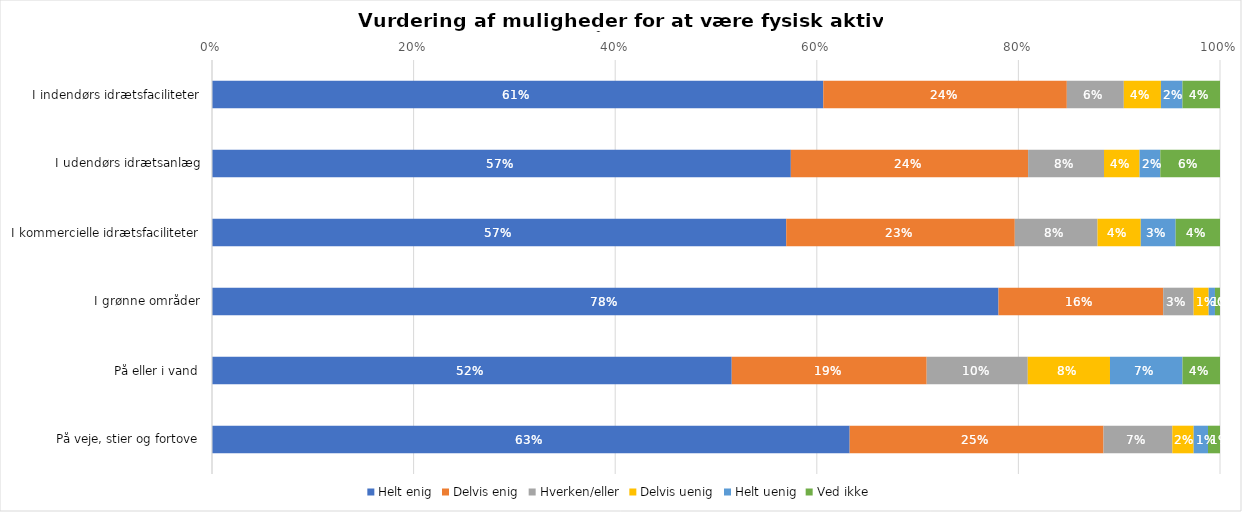
| Category | Helt enig | Delvis enig | Hverken/eller | Delvis uenig | Helt uenig | Ved ikke |
|---|---|---|---|---|---|---|
| I indendørs idrætsfaciliteter | 0.606 | 0.242 | 0.057 | 0.037 | 0.021 | 0.037 |
| I udendørs idrætsanlæg | 0.574 | 0.235 | 0.075 | 0.035 | 0.021 | 0.059 |
| I kommercielle idrætsfaciliteter | 0.57 | 0.227 | 0.082 | 0.043 | 0.035 | 0.044 |
| I grønne områder | 0.78 | 0.163 | 0.03 | 0.015 | 0.006 | 0.005 |
| På eller i vand | 0.516 | 0.193 | 0.1 | 0.082 | 0.072 | 0.037 |
| På veje, stier og fortove | 0.633 | 0.252 | 0.068 | 0.021 | 0.014 | 0.012 |